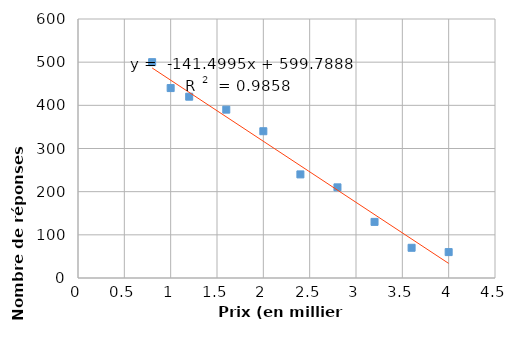
| Category | Series 0 |
|---|---|
| 4.0 | 60 |
| 3.6 | 70 |
| 3.2 | 130 |
| 2.8 | 210 |
| 2.4 | 240 |
| 2.0 | 340 |
| 1.6 | 390 |
| 1.2 | 420 |
| 1.0 | 440 |
| 0.8 | 500 |